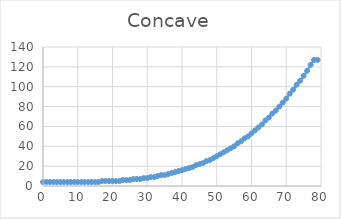
| Category | Series 0 |
|---|---|
| 0.0 | 4 |
| 1.0 | 4 |
| 2.0 | 4 |
| 3.0 | 4 |
| 4.0 | 4 |
| 5.0 | 4 |
| 6.0 | 4 |
| 7.0 | 4 |
| 8.0 | 4 |
| 9.0 | 4 |
| 10.0 | 4 |
| 11.0 | 4 |
| 12.0 | 4 |
| 13.0 | 4 |
| 14.0 | 4 |
| 15.0 | 4 |
| 16.0 | 4 |
| 17.0 | 5 |
| 18.0 | 5 |
| 19.0 | 5 |
| 20.0 | 5 |
| 21.0 | 5 |
| 22.0 | 5 |
| 23.0 | 6 |
| 24.0 | 6 |
| 25.0 | 6 |
| 26.0 | 7 |
| 27.0 | 7 |
| 28.0 | 7 |
| 29.0 | 8 |
| 30.0 | 8 |
| 31.0 | 9 |
| 32.0 | 9 |
| 33.0 | 10 |
| 34.0 | 11 |
| 35.0 | 11 |
| 36.0 | 12 |
| 37.0 | 13 |
| 38.0 | 14 |
| 39.0 | 15 |
| 40.0 | 16 |
| 41.0 | 17 |
| 42.0 | 18 |
| 43.0 | 19 |
| 44.0 | 21 |
| 45.0 | 22 |
| 46.0 | 23 |
| 47.0 | 25 |
| 48.0 | 26 |
| 49.0 | 28 |
| 50.0 | 30 |
| 51.0 | 32 |
| 52.0 | 34 |
| 53.0 | 36 |
| 54.0 | 38 |
| 55.0 | 40 |
| 56.0 | 43 |
| 57.0 | 45 |
| 58.0 | 48 |
| 59.0 | 50 |
| 60.0 | 53 |
| 61.0 | 56 |
| 62.0 | 59 |
| 63.0 | 62 |
| 64.0 | 66 |
| 65.0 | 69 |
| 66.0 | 73 |
| 67.0 | 76 |
| 68.0 | 80 |
| 69.0 | 84 |
| 70.0 | 88 |
| 71.0 | 93 |
| 72.0 | 97 |
| 73.0 | 102 |
| 74.0 | 106 |
| 75.0 | 111 |
| 76.0 | 116 |
| 77.0 | 122 |
| 78.0 | 127 |
| 79.0 | 127 |